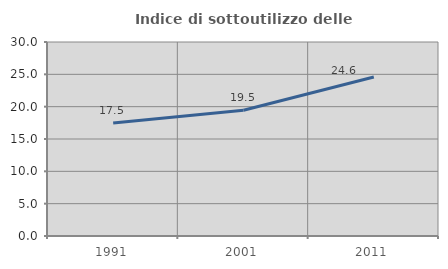
| Category | Indice di sottoutilizzo delle abitazioni  |
|---|---|
| 1991.0 | 17.458 |
| 2001.0 | 19.45 |
| 2011.0 | 24.583 |